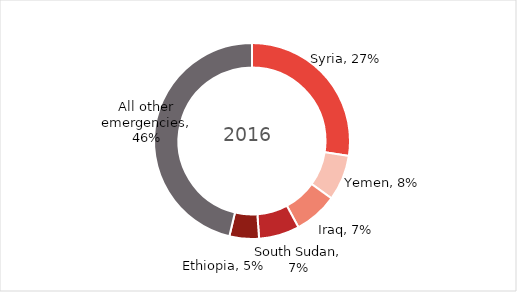
| Category | Series 0 |
|---|---|
| Syria | 0.274 |
| Yemen | 0.075 |
| Iraq | 0.072 |
| South Sudan | 0.067 |
| Ethiopia | 0.049 |
| All other emergencies | 0.463 |